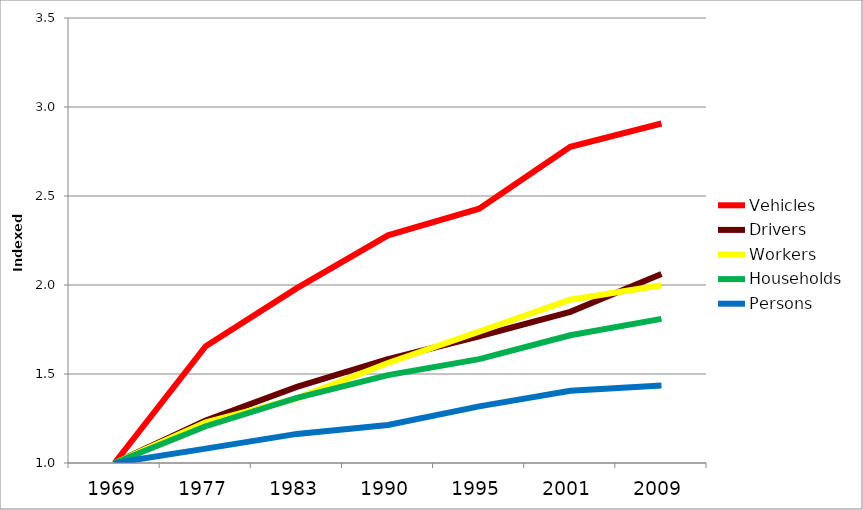
| Category | Vehicles | Drivers | Workers | Households | Persons |
|---|---|---|---|---|---|
| 1969.0 | 1 | 1 | 1 | 1 | 1 |
| 1977.0 | 1.657 | 1.239 | 1.228 | 1.207 | 1.081 |
| 1983.0 | 1.982 | 1.428 | 1.363 | 1.366 | 1.163 |
| 1990.0 | 2.279 | 1.583 | 1.562 | 1.493 | 1.214 |
| 1995.0 | 2.429 | 1.712 | 1.738 | 1.584 | 1.318 |
| 2001.0 | 2.777 | 1.849 | 1.918 | 1.718 | 1.406 |
| 2009.0 | 2.907 | 2.062 | 1.998 | 1.81 | 1.435 |